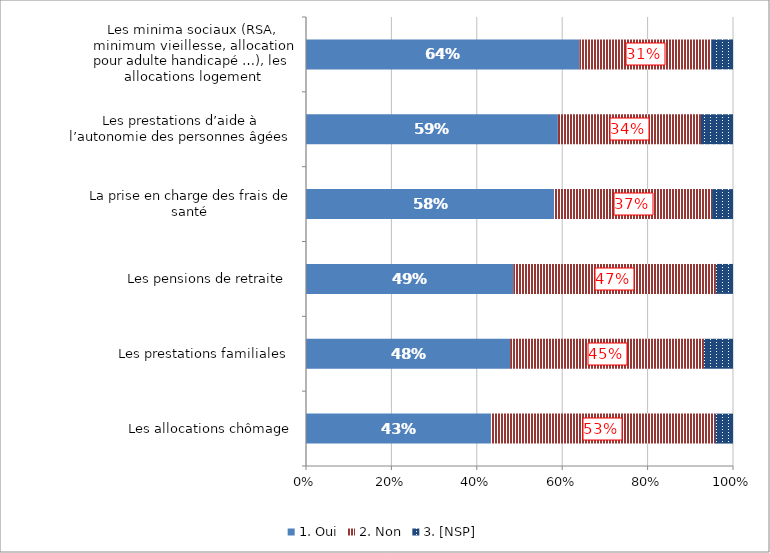
| Category | 1. Oui | 2. Non | 3. [NSP] |
|---|---|---|---|
| Les allocations chômage | 0.433 | 0.525 | 0.042 |
| Les prestations familiales  | 0.478 | 0.454 | 0.068 |
| Les pensions de retraite  | 0.485 | 0.474 | 0.04 |
| La prise en charge des frais de santé  | 0.581 | 0.37 | 0.049 |
| Les prestations d’aide à l’autonomie des personnes âgées | 0.59 | 0.335 | 0.075 |
| Les minima sociaux (RSA, minimum vieillesse, allocation pour adulte handicapé …), les allocations logement | 0.641 | 0.309 | 0.051 |